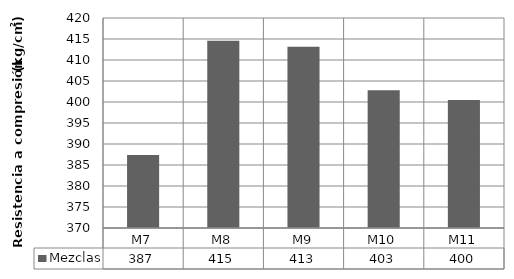
| Category | Mezclas |
|---|---|
| M7 | 387.401 |
| M8 | 414.591 |
| M9 | 413.139 |
| M10 | 402.796 |
| M11 | 400.448 |